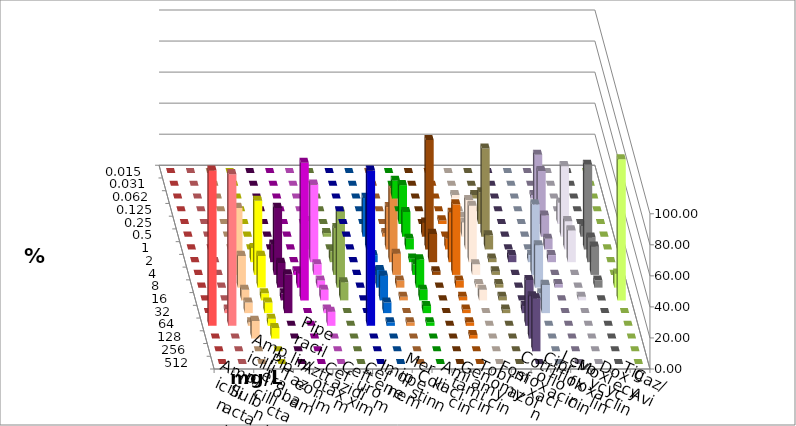
| Category | Ampicillin | Ampicillin/ Sulbactam | Piperacillin | Piperacillin/ Tazobactam | Aztreonam | Cefotaxim | Ceftazidim | Cefuroxim | Imipenem | Meropenem | Colistin | Amikacin | Gentamicin | Tobramycin | Fosfomycin | Cotrimoxazol | Ciprofloxacin | Levofloxacin | Moxifloxacin | Doxycyclin | Tigecyclin | Caz/Avi |
|---|---|---|---|---|---|---|---|---|---|---|---|---|---|---|---|---|---|---|---|---|---|---|
| 0.015 | 0 | 0 | 0 | 0 | 0 | 0 | 0 | 0 | 0 | 0 | 0 | 0 | 0 | 0 | 0 | 0 | 0 | 0 | 0 | 0 | 0 | 0 |
| 0.031 | 0 | 0 | 0 | 0 | 0 | 0 | 0 | 0 | 0 | 0 | 0 | 0 | 0 | 0 | 0 | 0 | 0 | 0 | 0 | 0 | 0 | 0 |
| 0.062 | 0 | 0 | 0 | 0 | 0 | 0 | 0 | 0 | 0 | 11.364 | 0 | 0 | 2.273 | 2.273 | 0 | 0 | 2.273 | 0 | 0 | 0 | 0 | 0 |
| 0.125 | 0 | 0 | 0 | 0 | 0 | 0 | 0 | 0 | 0 | 0 | 0 | 0 | 0 | 0 | 0 | 0 | 36.364 | 0 | 0 | 0 | 0 | 0 |
| 0.25 | 0 | 0 | 0 | 0 | 0 | 0 | 0 | 0 | 0 | 25 | 0 | 2.273 | 4.545 | 20.455 | 0 | 0 | 34.091 | 13.636 | 0 | 0 | 0 | 0 |
| 0.5 | 0 | 0 | 0 | 0 | 0 | 0 | 2.273 | 0 | 25 | 15.909 | 9.091 | 0 | 9.091 | 56.818 | 0 | 0 | 13.636 | 45.455 | 6.818 | 0 | 2.326 | 2.273 |
| 1.0 | 0 | 0 | 0 | 0 | 0 | 0 | 18.182 | 0 | 31.818 | 6.818 | 70.455 | 6.818 | 31.818 | 9.091 | 0 | 0 | 6.818 | 18.182 | 54.545 | 0 | 0 | 27.273 |
| 2.0 | 0 | 0 | 9.091 | 9.091 | 11.364 | 0 | 50 | 0 | 4.545 | 2.273 | 18.182 | 31.818 | 36.364 | 2.273 | 4.545 | 4.545 | 4.545 | 20.455 | 15.909 | 0 | 6.977 | 47.727 |
| 4.0 | 0 | 0 | 43.182 | 47.727 | 43.182 | 2.273 | 6.818 | 0 | 2.273 | 6.818 | 2.273 | 45.455 | 6.818 | 2.273 | 0 | 45.455 | 0 | 0 | 18.182 | 0 | 30.233 | 13.636 |
| 8.0 | 0 | 0 | 20.455 | 20.455 | 15.909 | 9.091 | 4.545 | 0 | 11.364 | 18.182 | 0 | 4.545 | 2.273 | 2.273 | 0 | 27.273 | 2.273 | 0 | 4.545 | 9.091 | 48.837 | 4.545 |
| 16.0 | 0 | 0 | 6.818 | 4.545 | 4.545 | 88.636 | 6.818 | 0 | 15.909 | 6.818 | 0 | 2.273 | 6.818 | 2.273 | 0 | 4.545 | 0 | 2.273 | 0 | 90.909 | 11.628 | 2.273 |
| 32.0 | 0 | 2.273 | 6.818 | 6.818 | 25 | 0 | 2.273 | 0 | 6.818 | 4.545 | 0 | 2.273 | 0 | 2.273 | 4.545 | 18.182 | 0 | 0 | 0 | 0 | 0 | 0 |
| 64.0 | 100 | 97.727 | 2.273 | 4.545 | 0 | 0 | 9.091 | 100 | 2.273 | 2.273 | 0 | 2.273 | 0 | 0 | 29.545 | 0 | 0 | 0 | 0 | 0 | 0 | 2.273 |
| 128.0 | 0 | 0 | 11.364 | 6.818 | 0 | 0 | 0 | 0 | 0 | 0 | 0 | 2.273 | 0 | 0 | 27.273 | 0 | 0 | 0 | 0 | 0 | 0 | 0 |
| 256.0 | 0 | 0 | 0 | 0 | 0 | 0 | 0 | 0 | 0 | 0 | 0 | 0 | 0 | 0 | 34.091 | 0 | 0 | 0 | 0 | 0 | 0 | 0 |
| 512.0 | 0 | 0 | 0 | 0 | 0 | 0 | 0 | 0 | 0 | 0 | 0 | 0 | 0 | 0 | 0 | 0 | 0 | 0 | 0 | 0 | 0 | 0 |